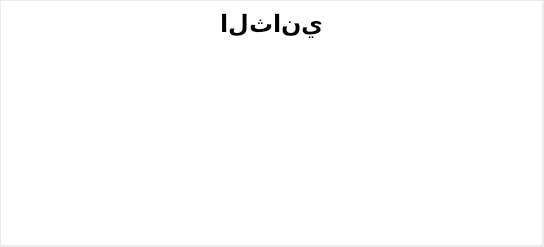
| Category | متفوق | % | متقدم | متمكن | غيرمجتاز |
|---|---|---|---|---|---|
| القرآن الكريم | 20 | 0 | 4 | 0 | 0 |
| التوحيد  | 24 | 0 | 0 | 0 | 0 |
| فقه | 24 | 0 | 0 | 0 | 0 |
| لغتي | 21 | 0 | 2 | 1 | 0 |
| العلوم | 24 | 0 | 0 | 0 | 0 |
| الرياضيات | 24 | 0 | 0 | 0 | 0 |